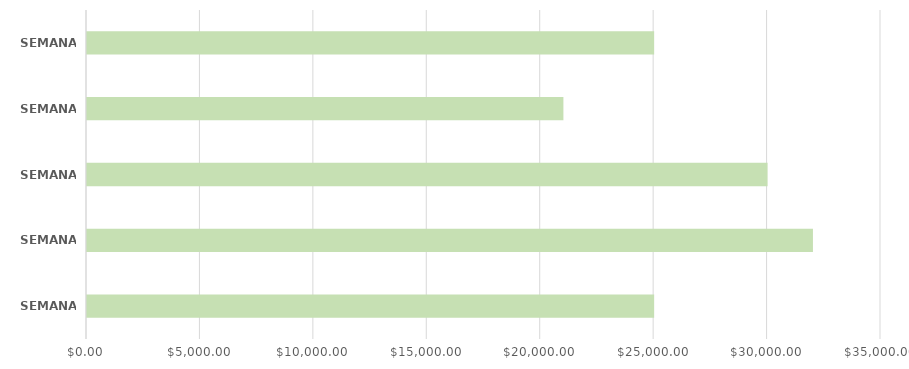
| Category | Series 0 |
|---|---|
| SEMANA 1 | 25000 |
| SEMANA 2 | 32000 |
| SEMANA 3 | 30000 |
| SEMANA 4 | 21000 |
| SEMANA 5 | 25000 |